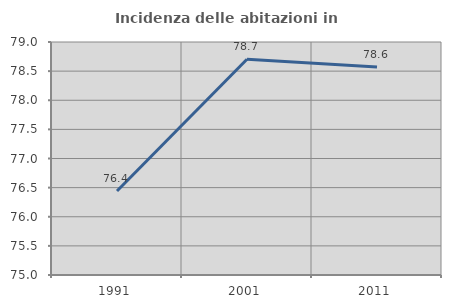
| Category | Incidenza delle abitazioni in proprietà  |
|---|---|
| 1991.0 | 76.442 |
| 2001.0 | 78.704 |
| 2011.0 | 78.571 |